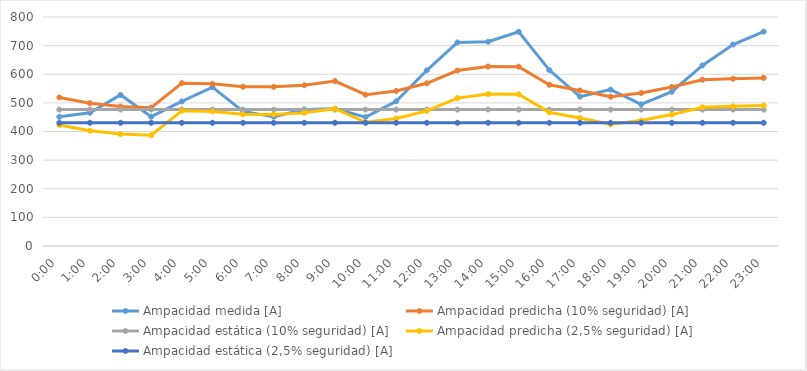
| Category | Ampacidad medida [A] | Ampacidad predicha (10% seguridad) [A] | Ampacidad estática (10% seguridad) [A] | Ampacidad predicha (2,5% seguridad) [A] | Ampacidad estática (2,5% seguridad) [A] |
|---|---|---|---|---|---|
| 0.0 | 451.325 | 518.907 | 476.5 | 422.473 | 430.4 |
| 0.041666666666666664 | 465.34 | 499.043 | 476.5 | 402.609 | 430.4 |
| 0.08333333333333333 | 527.837 | 487.315 | 476.5 | 390.881 | 430.4 |
| 0.125 | 451.659 | 483.264 | 476.5 | 386.831 | 430.4 |
| 0.166666666666667 | 505.13 | 568.926 | 476.5 | 472.492 | 430.4 |
| 0.208333333333333 | 554.893 | 566.549 | 476.5 | 470.116 | 430.4 |
| 0.25 | 470.134 | 556.557 | 476.5 | 460.123 | 430.4 |
| 0.291666666666667 | 451.899 | 555.984 | 476.5 | 459.55 | 430.4 |
| 0.333333333333333 | 476.862 | 561.491 | 476.5 | 465.058 | 430.4 |
| 0.375 | 479.438 | 576.191 | 476.5 | 479.757 | 430.4 |
| 0.416666666666667 | 450.225 | 528.61 | 476.5 | 432.176 | 430.4 |
| 0.458333333333333 | 505.542 | 541.63 | 476.5 | 445.196 | 430.4 |
| 0.5 | 613.761 | 568.319 | 476.5 | 471.886 | 430.4 |
| 0.541666666666667 | 711.064 | 613.028 | 476.5 | 516.594 | 430.4 |
| 0.583333333333333 | 713.39 | 627.042 | 476.5 | 530.609 | 430.4 |
| 0.625 | 748.443 | 626.547 | 476.5 | 530.114 | 430.4 |
| 0.666666666666667 | 614.568 | 563.298 | 476.5 | 466.865 | 430.4 |
| 0.708333333333333 | 521.621 | 543.318 | 476.5 | 446.884 | 430.4 |
| 0.75 | 546.263 | 521.48 | 476.5 | 425.046 | 430.4 |
| 0.791666666666667 | 495.143 | 534.578 | 476.5 | 438.145 | 430.4 |
| 0.833333333333333 | 538.984 | 555.517 | 476.5 | 459.083 | 430.4 |
| 0.875 | 630.718 | 581 | 476.5 | 484.567 | 430.4 |
| 0.916666666666667 | 703.828 | 584.259 | 476.5 | 487.825 | 430.4 |
| 0.958333333333333 | 748.888 | 587.199 | 476.5 | 490.766 | 430.4 |